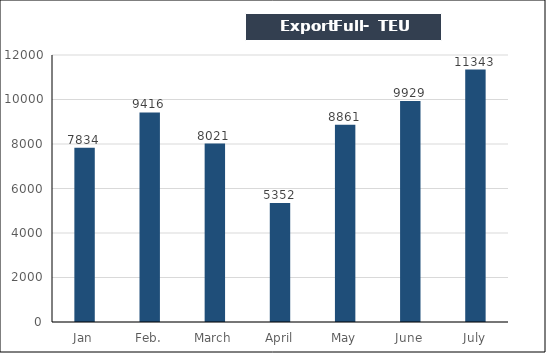
| Category | TEU |
|---|---|
| Jan | 7834 |
| Feb. | 9416 |
| March | 8021 |
| April | 5352 |
| May | 8861 |
| June | 9929 |
| July | 11343 |